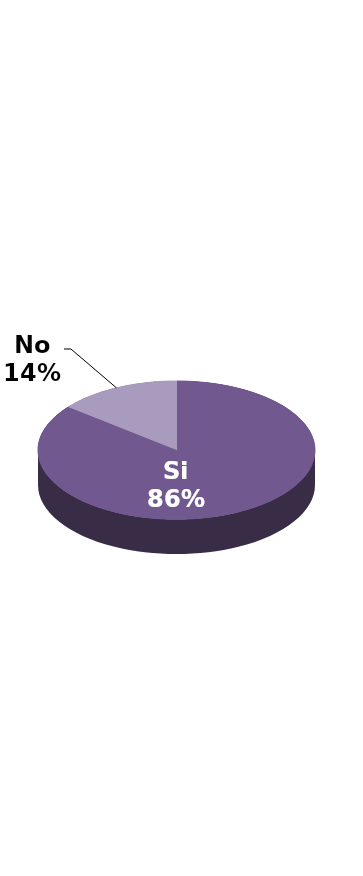
| Category | Series 1 |
|---|---|
| Si | 24 |
| No | 4 |